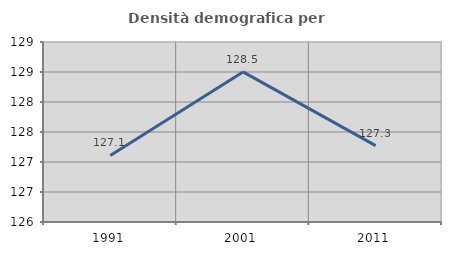
| Category | Densità demografica |
|---|---|
| 1991.0 | 127.109 |
| 2001.0 | 128.502 |
| 2011.0 | 127.273 |